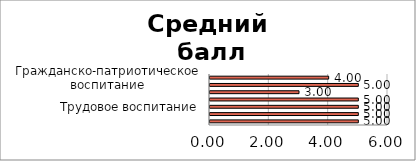
| Category | Средний
 балл |
|---|---|
| Гражданско-патриотическое воспитание | 4 |
| Духовно-нравственное воспитание | 5 |
| Эстетическое воспитания | 3 |
| Физическое воспитание | 5 |
| Трудовое воспитание | 5 |
| Экологическое воспитание | 5 |
| Ценность научного познания | 5 |